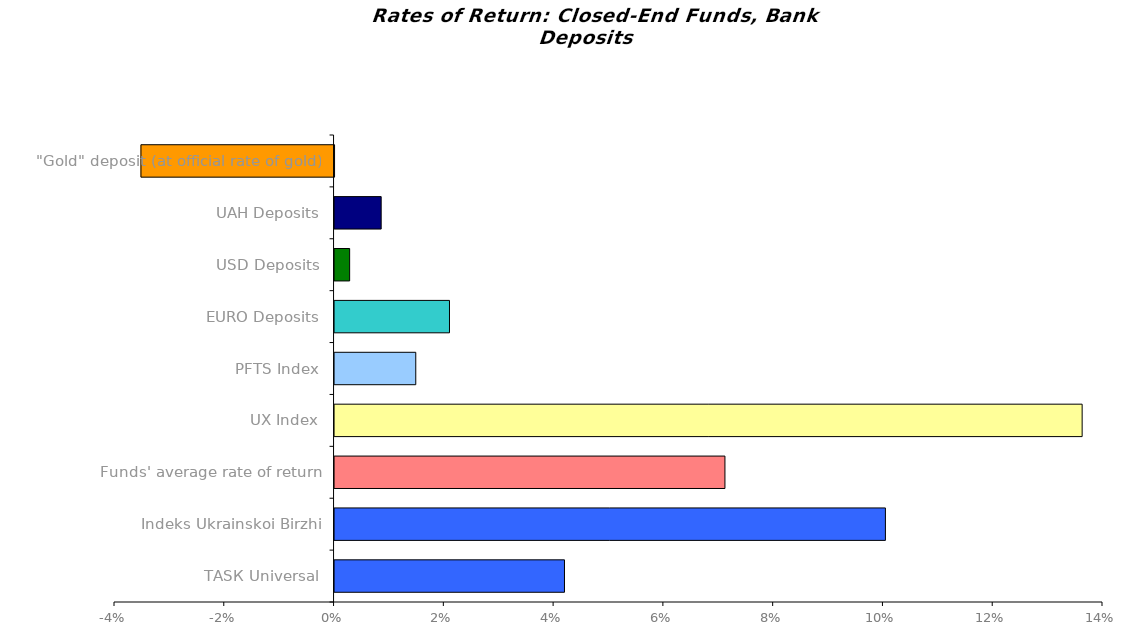
| Category | Series 0 |
|---|---|
| ТАSК Universal | 0.042 |
| Іndeks Ukrainskoi Birzhi | 0.1 |
| Funds' average rate of return | 0.071 |
| UX Index | 0.136 |
| PFTS Index | 0.015 |
| EURO Deposits | 0.021 |
| USD Deposits | 0.003 |
| UAH Deposits | 0.008 |
| "Gold" deposit (at official rate of gold) | -0.035 |